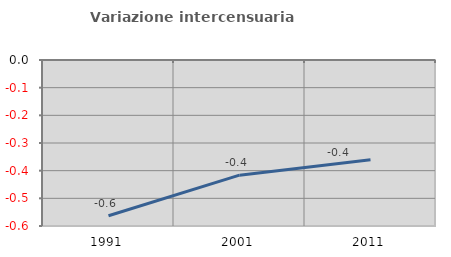
| Category | Variazione intercensuaria annua |
|---|---|
| 1991.0 | -0.563 |
| 2001.0 | -0.416 |
| 2011.0 | -0.361 |